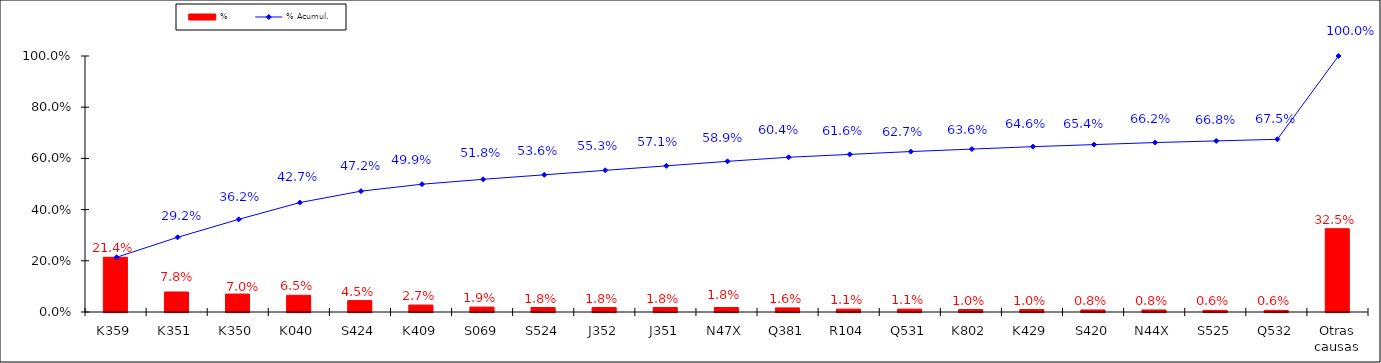
| Category | % |
|---|---|
| K359 | 0.214 |
| K351 | 0.078 |
| K350 | 0.07 |
| K040 | 0.065 |
| S424 | 0.045 |
| K409 | 0.027 |
| S069 | 0.019 |
| S524 | 0.018 |
| J352 | 0.018 |
| J351 | 0.018 |
| N47X | 0.018 |
| Q381 | 0.016 |
| R104 | 0.011 |
| Q531 | 0.011 |
| K802 | 0.01 |
| K429 | 0.01 |
| S420 | 0.008 |
| N44X | 0.008 |
| S525 | 0.006 |
| Q532 | 0.006 |
| Otras causas | 0.325 |